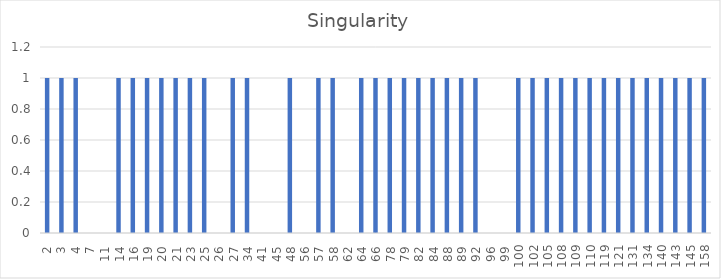
| Category | Series 0 |
|---|---|
| 2.0 | 1 |
| 3.0 | 1 |
| 4.0 | 1 |
| 7.0 | 0 |
| 11.0 | 0 |
| 14.0 | 1 |
| 16.0 | 1 |
| 19.0 | 1 |
| 20.0 | 1 |
| 21.0 | 1 |
| 23.0 | 1 |
| 25.0 | 1 |
| 26.0 | 0 |
| 27.0 | 1 |
| 34.0 | 1 |
| 41.0 | 0 |
| 45.0 | 0 |
| 48.0 | 1 |
| 56.0 | 0 |
| 57.0 | 1 |
| 58.0 | 1 |
| 62.0 | 0 |
| 64.0 | 1 |
| 66.0 | 1 |
| 78.0 | 1 |
| 79.0 | 1 |
| 82.0 | 1 |
| 84.0 | 1 |
| 88.0 | 1 |
| 89.0 | 1 |
| 92.0 | 1 |
| 96.0 | 0 |
| 99.0 | 0 |
| 100.0 | 1 |
| 102.0 | 1 |
| 105.0 | 1 |
| 108.0 | 1 |
| 109.0 | 1 |
| 110.0 | 1 |
| 119.0 | 1 |
| 121.0 | 1 |
| 131.0 | 1 |
| 134.0 | 1 |
| 140.0 | 1 |
| 143.0 | 1 |
| 145.0 | 1 |
| 158.0 | 1 |